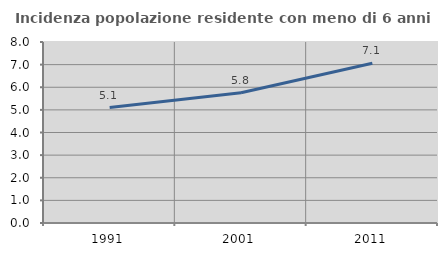
| Category | Incidenza popolazione residente con meno di 6 anni |
|---|---|
| 1991.0 | 5.1 |
| 2001.0 | 5.757 |
| 2011.0 | 7.06 |